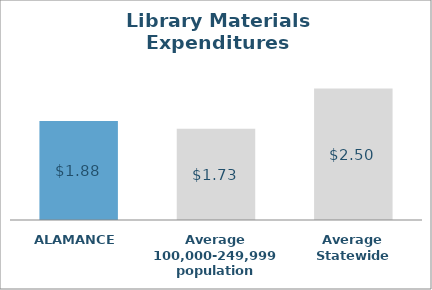
| Category | Series 0 |
|---|---|
| ALAMANCE | 1.879 |
| Average 100,000-249,999 population | 1.73 |
| Average Statewide | 2.498 |